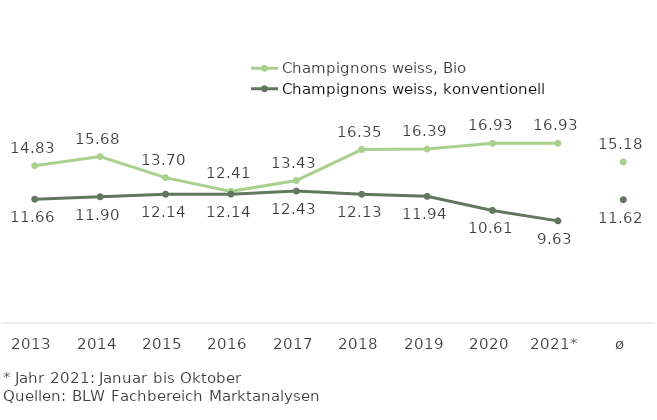
| Category | Champignons weiss, Bio | Champignons weiss, konventionell |
|---|---|---|
| 2013 | 14.828 | 11.661 |
| 2014 | 15.682 | 11.897 |
| 2015 | 13.703 | 12.14 |
| 2016 | 12.406 | 12.144 |
| 2017 | 13.428 | 12.432 |
| 2018 | 16.348 | 12.131 |
| 2019 | 16.387 | 11.936 |
| 2020 | 16.93 | 10.61 |
| 2021* | 16.928 | 9.625 |
| ø | 15.182 | 11.619 |